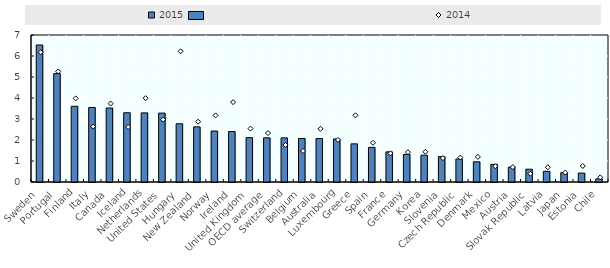
| Category | 2015 |
|---|---|
| Sweden | 6.525 |
| Portugal | 5.161 |
| Finland | 3.606 |
| Italy | 3.55 |
| Canada | 3.524 |
| Iceland | 3.297 |
| Netherlands | 3.29 |
| United States | 3.28 |
| Hungary | 2.773 |
| New Zealand | 2.627 |
| Norway | 2.427 |
| Ireland | 2.404 |
| United Kingdom | 2.111 |
| OECD average | 2.103 |
| Switzerland | 2.1 |
| Belgium | 2.075 |
| Australia | 2.068 |
| Luxembourg | 2.051 |
| Greece | 1.816 |
| Spain | 1.649 |
| France | 1.435 |
| Germany | 1.315 |
| Korea | 1.277 |
| Slovenia | 1.209 |
| Czech Republic | 1.096 |
| Denmark | 0.962 |
| Mexico | 0.839 |
| Austria | 0.711 |
| Slovak Republic | 0.609 |
| Latvia | 0.508 |
| Japan | 0.446 |
| Estonia | 0.424 |
| Chile | 0.147 |